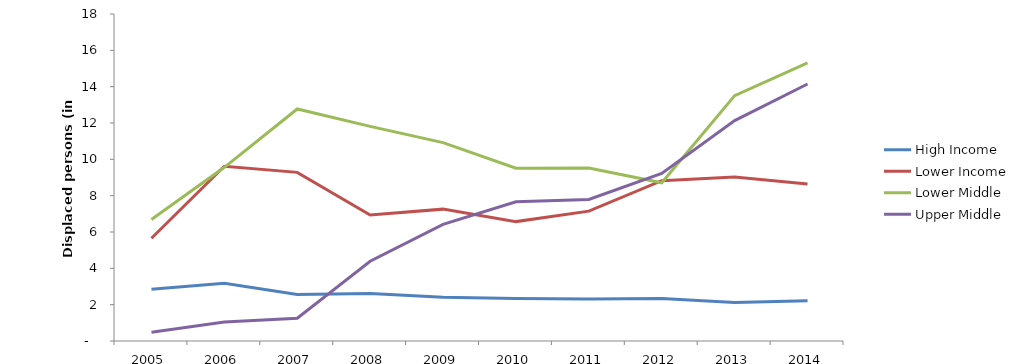
| Category | High Income | Lower Income | Lower Middle | Upper Middle |
|---|---|---|---|---|
| 2005.0 | 2.853 | 5.659 | 6.688 | 0.486 |
| 2006.0 | 3.183 | 9.62 | 9.56 | 1.05 |
| 2007.0 | 2.56 | 9.284 | 12.772 | 1.256 |
| 2008.0 | 2.614 | 6.939 | 11.813 | 4.39 |
| 2009.0 | 2.413 | 7.259 | 10.919 | 6.423 |
| 2010.0 | 2.339 | 6.572 | 9.511 | 7.664 |
| 2011.0 | 2.313 | 7.149 | 9.52 | 7.792 |
| 2012.0 | 2.343 | 8.825 | 8.706 | 9.222 |
| 2013.0 | 2.126 | 9.029 | 13.506 | 12.132 |
| 2014.0 | 2.212 | 8.639 | 15.303 | 14.145 |